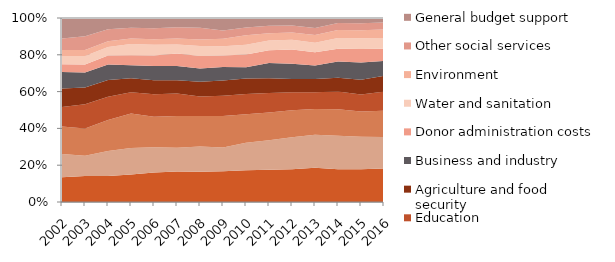
| Category | Health | Infrastructure | Governance and security | Education | Agriculture and food security | Business and industry | Donor administration costs | Water and sanitation | Environment | Other social services | General budget support |
|---|---|---|---|---|---|---|---|---|---|---|---|
| 2002.0 | 5960.271 | 5569.632 | 6580.517 | 4655.313 | 4430.267 | 3936.442 | 1889.721 | 1981.045 | 1452.261 | 2761.566 | 4886.501 |
| 2003.0 | 7070.268 | 5488.539 | 7380.335 | 6547.298 | 4517.815 | 4050.758 | 2196.934 | 2297.239 | 1608.887 | 3775.67 | 4910.567 |
| 2004.0 | 7972.168 | 7618.559 | 9458.204 | 7096.84 | 5108.675 | 4717.678 | 2722.864 | 2641.226 | 1778.052 | 3593.367 | 3467.166 |
| 2005.0 | 10289.928 | 9965.461 | 12991.442 | 7917.449 | 5229.865 | 4920.011 | 3699.942 | 4244.487 | 2039.718 | 4071.001 | 3666.655 |
| 2006.0 | 11552.335 | 9883.031 | 11865.352 | 8819.548 | 5470.101 | 5555.833 | 4179.042 | 4137.57 | 2211.35 | 4293.751 | 3970.362 |
| 2007.0 | 13302.524 | 10341.409 | 13871.073 | 9830.037 | 5828.005 | 6222.273 | 5445.84 | 3951.424 | 2633.964 | 4908.267 | 4000.155 |
| 2008.0 | 14684.058 | 12225.674 | 14729.603 | 9485.327 | 7109.146 | 6466.825 | 6026.422 | 4939.351 | 3135.662 | 5618.883 | 4767.995 |
| 2009.0 | 16643.938 | 12799.089 | 16959.483 | 10942.382 | 8214.731 | 7417.84 | 6136.247 | 5068.059 | 3994.935 | 4494.334 | 6709.329 |
| 2010.0 | 17946.207 | 15518.572 | 16142.631 | 11436.91 | 8776.073 | 6422.401 | 7136.631 | 5575.164 | 5405.359 | 4383.925 | 5320.684 |
| 2011.0 | 18312.636 | 16724.053 | 15854.007 | 11020.315 | 8351.498 | 8666.047 | 7290.919 | 5590.61 | 4124.31 | 4148.658 | 4453.929 |
| 2012.0 | 18885.64 | 18456.033 | 15626.716 | 10407.739 | 7649.114 | 8742.595 | 8198.8 | 5666.072 | 4260.843 | 4035.303 | 4271.876 |
| 2013.0 | 20885.681 | 20100.197 | 15723.979 | 10214.097 | 8134.423 | 8266.038 | 8069.201 | 5756.75 | 4746.833 | 4245.96 | 6106.465 |
| 2014.0 | 19684.57 | 20125.805 | 16007.698 | 10606.564 | 8312.873 | 9801.848 | 7743.328 | 6436.905 | 4804.719 | 4135.523 | 3071.346 |
| 2015.0 | 20424.494 | 20158.95 | 15626.363 | 10613.589 | 9209.953 | 10780.584 | 8401.205 | 6601.995 | 5021.887 | 4248.406 | 3328.998 |
| 2016.0 | 21048.679 | 19884.448 | 16406.725 | 12144.062 | 9787.399 | 9464.829 | 7568.098 | 6804.014 | 5301.29 | 4422.501 | 2866.184 |